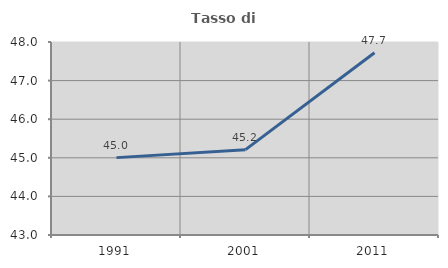
| Category | Tasso di occupazione   |
|---|---|
| 1991.0 | 45.005 |
| 2001.0 | 45.211 |
| 2011.0 | 47.721 |